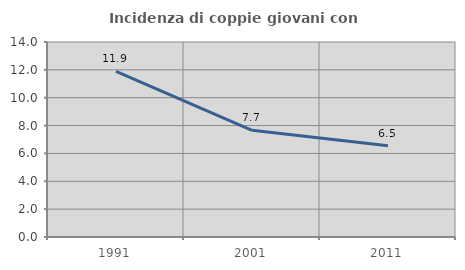
| Category | Incidenza di coppie giovani con figli |
|---|---|
| 1991.0 | 11.895 |
| 2001.0 | 7.661 |
| 2011.0 | 6.547 |